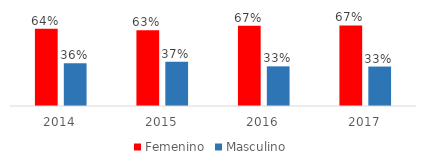
| Category | Femenino | Masculino |
|---|---|---|
| 2014.0 | 0.644 | 0.356 |
| 2015.0 | 0.632 | 0.368 |
| 2016.0 | 0.67 | 0.33 |
| 2017.0 | 0.671 | 0.329 |